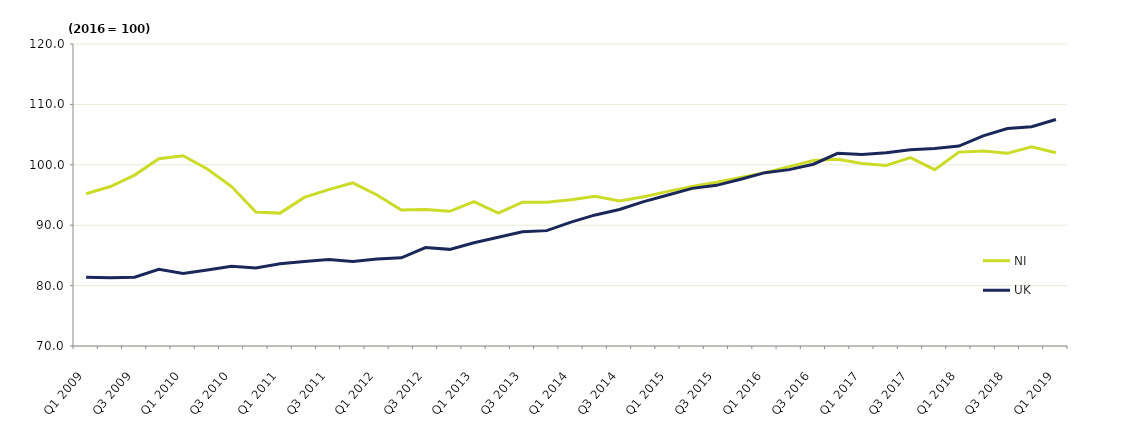
| Category | NI | UK |
|---|---|---|
| Q1 2009 | 95.2 | 81.4 |
| Q2 2009 | 96.4 | 81.3 |
| Q3 2009 | 98.3 | 81.4 |
| Q4 2009 | 101 | 82.7 |
| Q1 2010 | 101.5 | 82 |
| Q2 2010 | 99.3 | 82.6 |
| Q3 2010 | 96.4 | 83.2 |
| Q4 2010 | 92.2 | 82.9 |
| Q1 2011 | 92 | 83.6 |
| Q2 2011 | 94.6 | 84 |
| Q3 2011 | 95.9 | 84.3 |
| Q4 2011 | 97 | 84 |
| Q1 2012 | 95 | 84.4 |
| Q2 2012 | 92.5 | 84.6 |
| Q3 2012 | 92.6 | 86.3 |
| Q4 2012 | 92.3 | 86 |
| Q1 2013 | 93.9 | 87.1 |
| Q2 2013 | 92 | 88 |
| Q3 2013 | 93.8 | 88.9 |
| Q4 2013 | 93.8 | 89.1 |
| Q1 2014 | 94.2 | 90.5 |
| Q2 2014 | 94.8 | 91.7 |
| Q3 2014 | 94 | 92.6 |
| Q4 2014 | 94.7 | 93.9 |
| Q1 2015 | 95.6 | 95 |
| Q2 2015 | 96.4 | 96.1 |
| Q3 2015 | 97.1 | 96.6 |
| Q4 2015 | 97.9 | 97.6 |
| Q1 2016 | 98.7 | 98.7 |
| Q2 2016 | 99.7 | 99.2 |
| Q3 2016 | 100.7 | 100.1 |
| Q4 2016 | 100.9 | 101.9 |
| Q1 2017 | 100.2 | 101.7 |
| Q2 2017 | 99.9 | 102 |
| Q3 2017 | 101.2 | 102.5 |
| Q4 2017 | 99.2 | 102.7 |
| Q1 2018 | 102.1 | 103.1 |
| Q2 2018 | 102.3 | 104.8 |
| Q3 2018 | 101.9 | 106 |
| Q4 2018 | 103 | 106.3 |
| Q1 2019 | 102 | 107.5 |